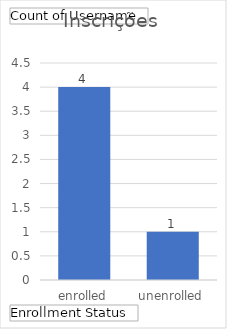
| Category | Total |
|---|---|
| enrolled | 4 |
| unenrolled | 1 |